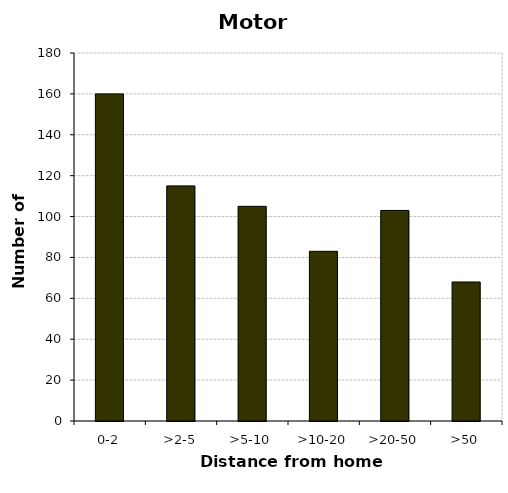
| Category | Motorcycles |
|---|---|
| 0-2 | 160 |
| >2-5 | 115 |
| >5-10 | 105 |
| >10-20 | 83 |
| >20-50 | 103 |
| >50 | 68 |